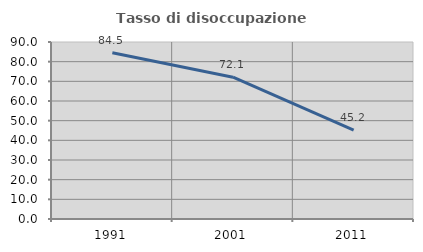
| Category | Tasso di disoccupazione giovanile  |
|---|---|
| 1991.0 | 84.533 |
| 2001.0 | 72.101 |
| 2011.0 | 45.161 |